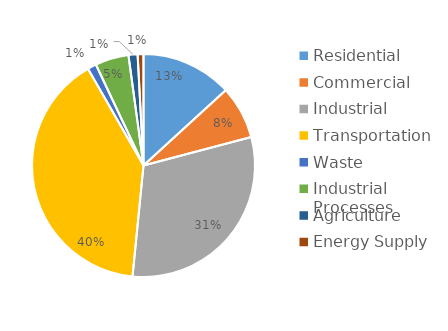
| Category | MTCO2e* |
|---|---|
| Residential | 114547.826 |
| Commercial | 66763.488 |
| Industrial | 266579.016 |
| Transportation | 348584.172 |
| Waste | 11072.588 |
| Industrial Processes | 42218.925 |
| Agriculture | 11405.473 |
| Energy Supply | 7337.338 |